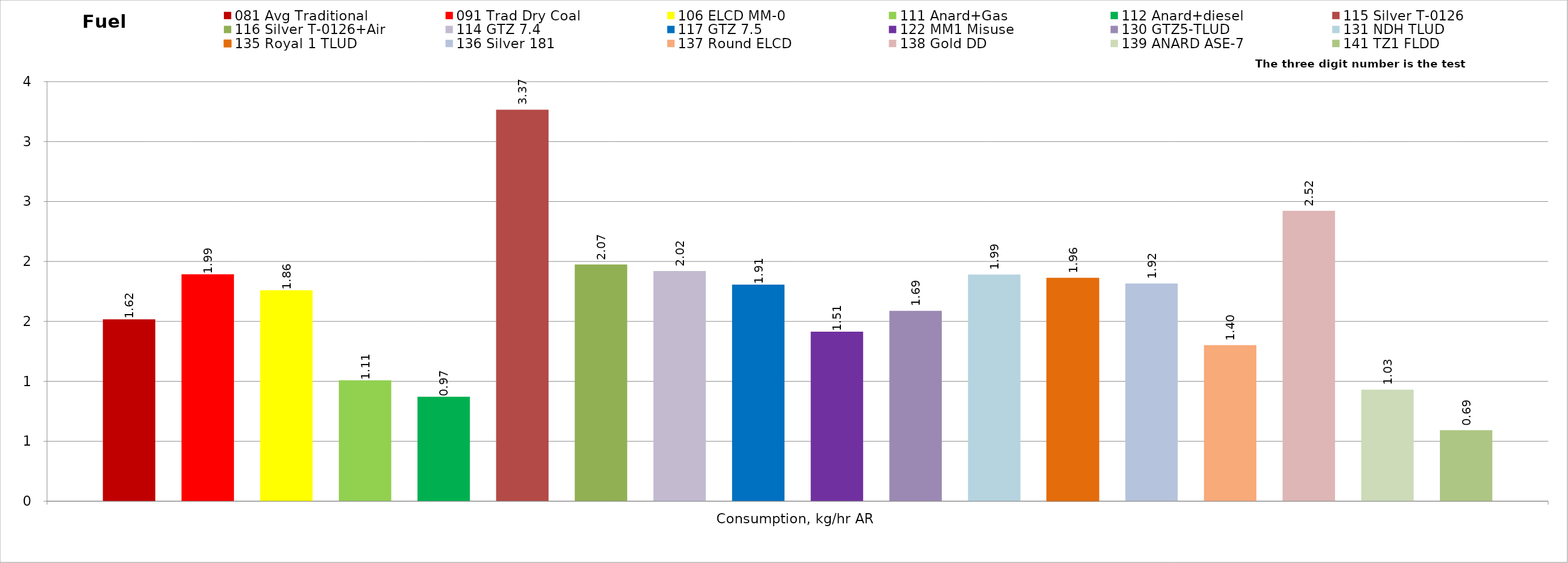
| Category | 081 Avg Traditional | 091 Trad Dry Coal | 106 ELCD MM-0 | 111 Anard+Gas | 112 Anard+diesel | 115 Silver T-0126 | 116 Silver T-0126+Air | 114 GTZ 7.4 | 117 GTZ 7.5 | 122 MM1 Misuse | 130 GTZ5-TLUD | 131 NDH TLUD | 135 Royal 1 TLUD | 136 Silver 181 | 137 Round ELCD | 138 Gold DD | 139 ANARD ASE-7 | 141 TZ1 FLDD |
|---|---|---|---|---|---|---|---|---|---|---|---|---|---|---|---|---|---|---|
| Consumption, kg/hr AR | 1.617 | 1.993 | 1.859 | 1.109 | 0.971 | 3.366 | 2.074 | 2.02 | 1.907 | 1.514 | 1.688 | 1.991 | 1.962 | 1.916 | 1.402 | 2.523 | 1.031 | 0.693 |